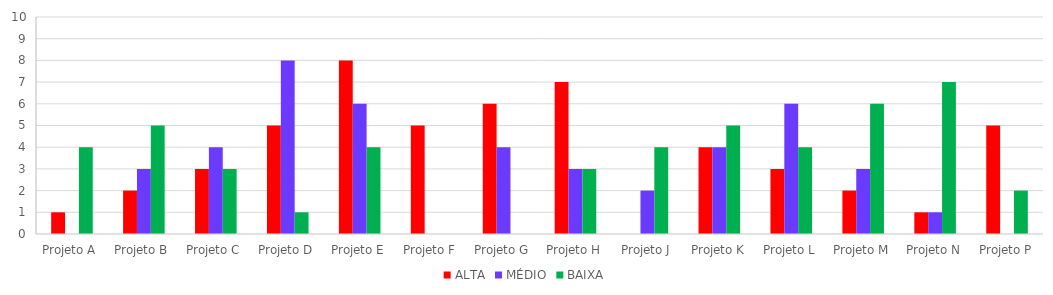
| Category | ALTA | MÉDIO | BAIXA |
|---|---|---|---|
| Projeto A | 1 | 0 | 4 |
| Projeto B | 2 | 3 | 5 |
| Projeto C | 3 | 4 | 3 |
| Projeto D | 5 | 8 | 1 |
| Projeto E | 8 | 6 | 4 |
| Projeto F | 5 | 0 | 0 |
| Projeto G | 6 | 4 | 0 |
| Projeto H | 7 | 3 | 3 |
| Projeto J | 0 | 2 | 4 |
| Projeto K | 4 | 4 | 5 |
| Projeto L | 3 | 6 | 4 |
| Projeto M | 2 | 3 | 6 |
| Projeto N | 1 | 1 | 7 |
| Projeto P | 5 | 0 | 2 |